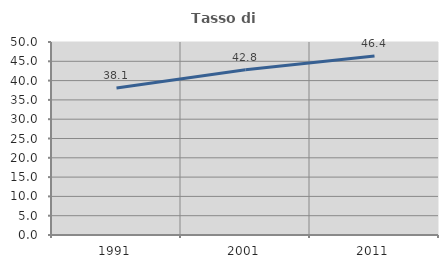
| Category | Tasso di occupazione   |
|---|---|
| 1991.0 | 38.109 |
| 2001.0 | 42.797 |
| 2011.0 | 46.354 |